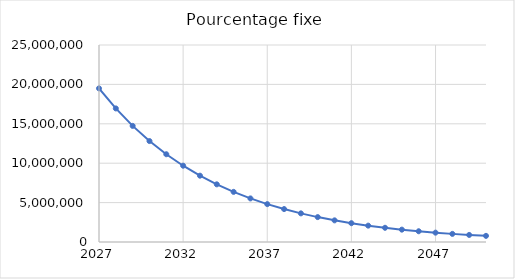
| Category | Pourcentage fixe |
|---|---|
| 2027.0 | 19495584 |
| 2028.0 | 16948885.626 |
| 2029.0 | 14734861.184 |
| 2030.0 | 12810053.647 |
| 2031.0 | 11136682.755 |
| 2032.0 | 9681903.464 |
| 2033.0 | 8417161.263 |
| 2034.0 | 7317631.703 |
| 2035.0 | 6361733.138 |
| 2036.0 | 5530703.124 |
| 2037.0 | 4808230.145 |
| 2038.0 | 4180133.449 |
| 2039.0 | 3634084.71 |
| 2040.0 | 3159366.044 |
| 2041.0 | 2746659.64 |
| 2042.0 | 2387864.867 |
| 2043.0 | 2075939.275 |
| 2044.0 | 1804760.367 |
| 2045.0 | 1569005.424 |
| 2046.0 | 1364047.032 |
| 2047.0 | 1185862.251 |
| 2048.0 | 1030953.659 |
| 2049.0 | 896280.699 |
| 2050.0 | 779200 |